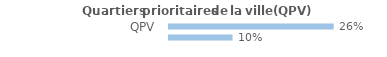
| Category | Series 0 |
|---|---|
| QPV | 0.256 |
| Hors QPV | 0.099 |